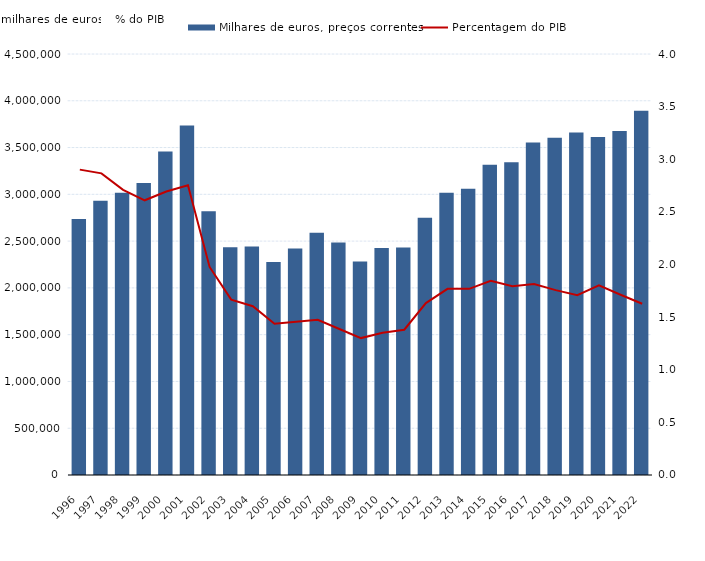
| Category | Milhares de euros, preços correntes |
|---|---|
| 1996.0 | 2737490 |
| 1997.0 | 2932550 |
| 1998.0 | 3016290 |
| 1999.0 | 3121680 |
| 2000.0 | 3458120 |
| 2001.0 | 3736820 |
| 2002.0 | 2817880 |
| 2003.0 | 2433780 |
| 2004.0 | 2442160 |
| 2005.0 | 2277250 |
| 2006.0 | 2420270 |
| 2007.0 | 2588420 |
| 2008.0 | 2484680 |
| 2009.0 | 2281870 |
| 2010.0 | 2425900 |
| 2011.0 | 2430490 |
| 2012.0 | 2749460 |
| 2013.0 | 3015780 |
| 2014.0 | 3060710 |
| 2015.0 | 3315620 |
| 2016.0 | 3343200 |
| 2017.0 | 3554750 |
| 2018.0 | 3604010 |
| 2019.0 | 3662130 |
| 2020.0 | 3612860 |
| 2021.0 | 3677760 |
| 2022.0 | 3892260 |